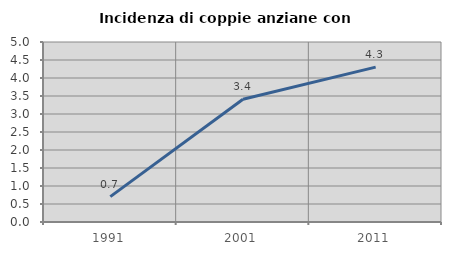
| Category | Incidenza di coppie anziane con figli |
|---|---|
| 1991.0 | 0.704 |
| 2001.0 | 3.409 |
| 2011.0 | 4.301 |